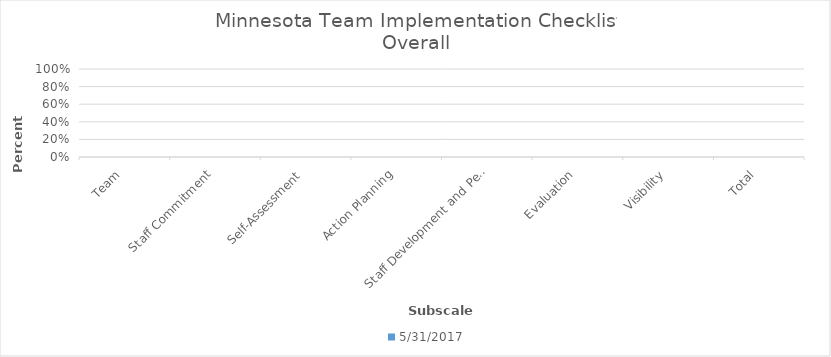
| Category | 5/31/17 |
|---|---|
| Team | 0 |
| Staff Commitment | 0 |
| Self-Assessment | 0 |
| Action Planning | 0 |
| Staff Development and Performance | 0 |
| Evaluation | 0 |
| Visibility | 0 |
| Total | 0 |